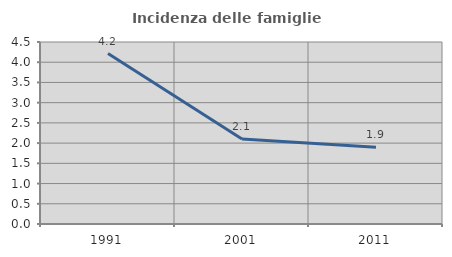
| Category | Incidenza delle famiglie numerose |
|---|---|
| 1991.0 | 4.213 |
| 2001.0 | 2.1 |
| 2011.0 | 1.896 |